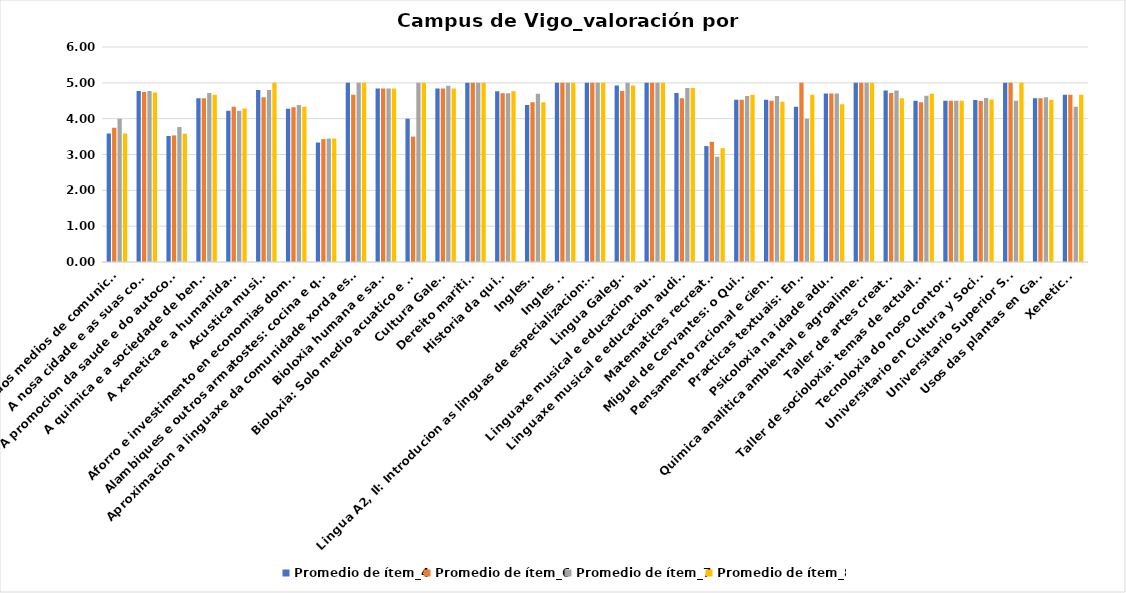
| Category | Promedio de ítem_4 | Promedio de ítem_6 | Promedio de ítem_7 | Promedio de ítem_8 |
|---|---|---|---|---|
| A linguaxe dos medios de comunicacion | 3.588 | 3.75 | 4 | 3.588 |
| A nosa cidade e as suas cousas | 4.774 | 4.742 | 4.774 | 4.733 |
| A promocion da saude e do autocoidado | 3.516 | 3.533 | 3.767 | 3.581 |
| A quimica e a sociedade de benestar | 4.571 | 4.571 | 4.714 | 4.667 |
| A xenetica e a humanidade 2 | 4.222 | 4.333 | 4.222 | 4.286 |
| Acustica musical | 4.8 | 4.6 | 4.8 | 5 |
| Aforro e investimento en economias domesticas | 4.28 | 4.32 | 4.385 | 4.333 |
| Alambiques e outros armatostes: cocina e quimica | 3.333 | 3.429 | 3.444 | 3.444 |
| Aproximacion a linguaxe da comunidade xorda espanola | 5 | 4.667 | 5 | 5 |
| Bioloxia humana e saude | 4.842 | 4.842 | 4.842 | 4.842 |
| Bioloxia: Solo medio acuatico e clima | 4 | 3.5 | 5 | 5 |
| Cultura Galega | 4.84 | 4.84 | 4.92 | 4.84 |
| Dereito maritimo | 5 | 5 | 5 | 5 |
| Historia da quimica | 4.765 | 4.706 | 4.706 | 4.765 |
| Ingles II | 4.385 | 4.462 | 4.692 | 4.462 |
| Ingles IV | 5 | 5 | 5 | 5 |
| Lingua A2, II: Introducion as linguas de especializacion: Espanol | 5 | 5 | 5 | 5 |
| Lingua Galega II | 4.923 | 4.769 | 5 | 4.923 |
| Linguaxe musical e educacion auditiva | 5 | 5 | 5 | 5 |
| Linguaxe musical e educacion auditiva II | 4.714 | 4.571 | 4.857 | 4.857 |
| Matematicas recreativas | 3.235 | 3.353 | 2.938 | 3.176 |
| Miguel de Cervantes: o Quixote | 4.526 | 4.526 | 4.632 | 4.667 |
| Pensamento racional e cientifico | 4.526 | 4.5 | 4.632 | 4.474 |
| Practicas textuais: Ensaio | 4.333 | 5 | 4 | 4.667 |
| Psicoloxia na idade adulta II | 4.7 | 4.7 | 4.7 | 4.4 |
| Quimica analitica ambiental e agroalimentaria | 5 | 5 | 5 | 5 |
| Taller de artes creativas | 4.786 | 4.714 | 4.786 | 4.571 |
| Taller de socioloxia: temas de actualidade | 4.5 | 4.462 | 4.643 | 4.692 |
| Tecnoloxia do noso contorno II | 4.5 | 4.5 | 4.5 | 4.5 |
| Universitario en Cultura y Sociedad | 4.519 | 4.491 | 4.574 | 4.537 |
| Universitario Superior Senior | 5 | 5 | 4.5 | 5 |
| Usos das plantas en Galicia | 4.568 | 4.568 | 4.595 | 4.528 |
| Xenetica I | 4.667 | 4.667 | 4.333 | 4.667 |